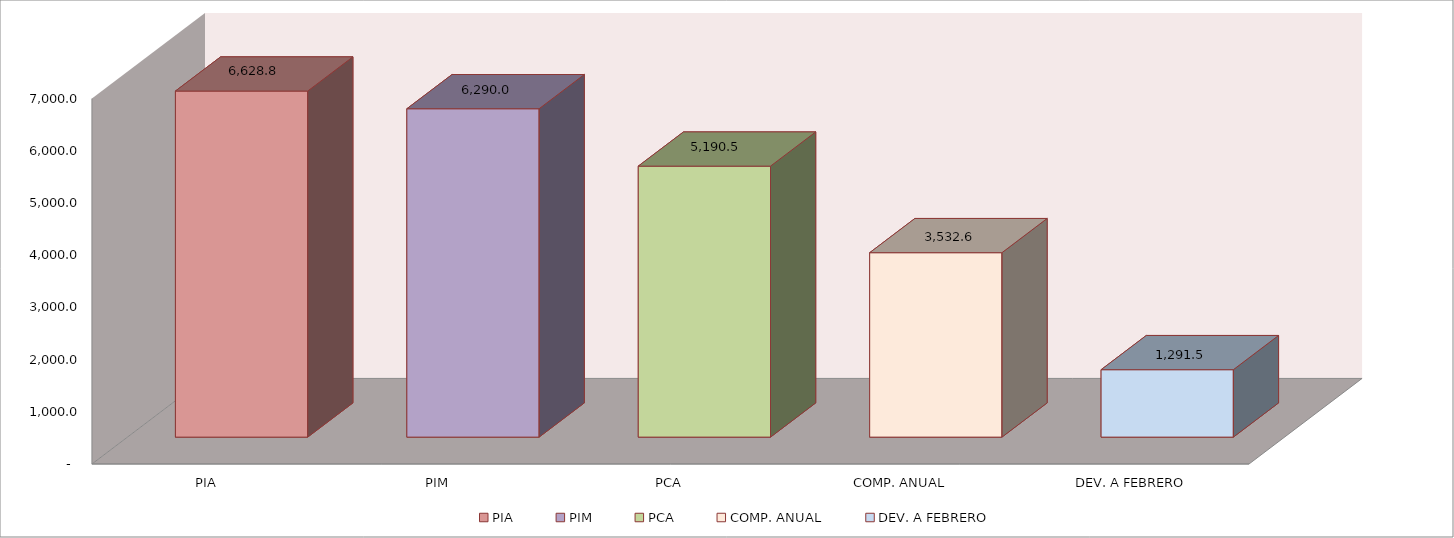
| Category | 011 MINISTERIO DE SALUD |
|---|---|
| PIA | 6628.781 |
| PIM | 6290.046 |
| PCA | 5190.531 |
| COMP. ANUAL | 3532.613 |
| DEV. A FEBRERO | 1291.485 |